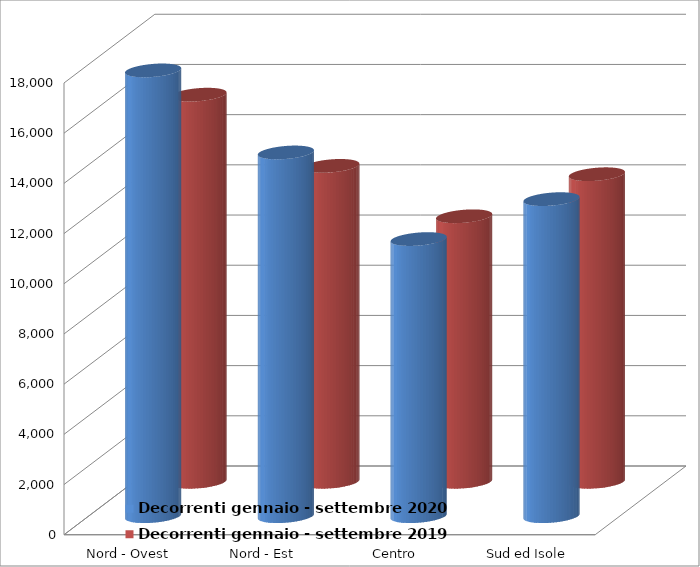
| Category | Decorrenti gennaio - settembre 2020 | Decorrenti gennaio - settembre 2019 |
|---|---|---|
| Nord - Ovest | 17762 | 15426 |
| Nord - Est | 14493 | 12589 |
| Centro | 11042 | 10581 |
| Sud ed Isole | 12633 | 12256 |